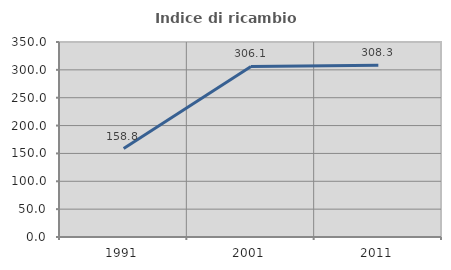
| Category | Indice di ricambio occupazionale  |
|---|---|
| 1991.0 | 158.784 |
| 2001.0 | 306.061 |
| 2011.0 | 308.28 |